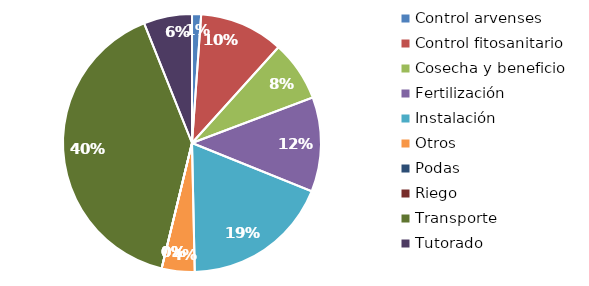
| Category | Valor |
|---|---|
| Control arvenses | 180000 |
| Control fitosanitario | 1669800 |
| Cosecha y beneficio | 1200000 |
| Fertilización | 1876000 |
| Instalación | 2938300 |
| Otros | 652500 |
| Podas | 0 |
| Riego | 0 |
| Transporte | 6360000 |
| Tutorado | 960000 |